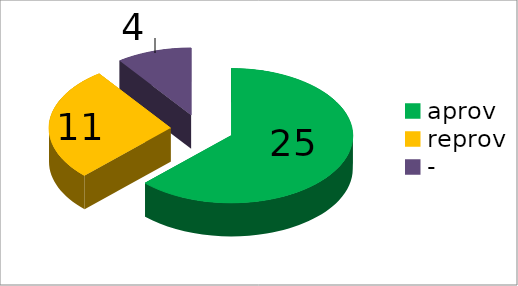
| Category | Series 0 |
|---|---|
| aprov | 25 |
| reprov | 11 |
| - | 4 |